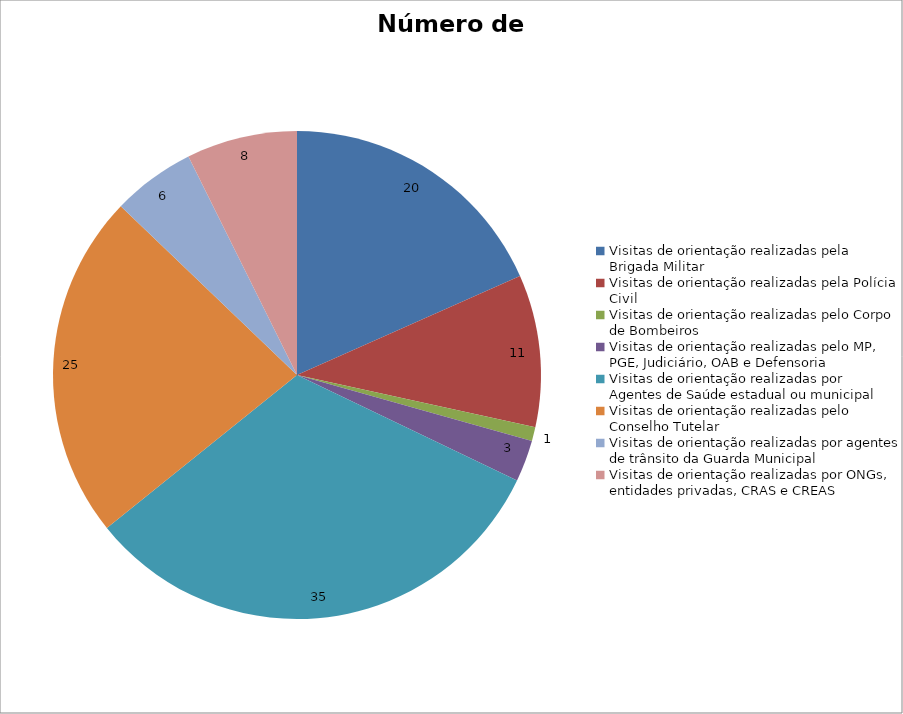
| Category | Número de Ações |
|---|---|
| Visitas de orientação realizadas pela Brigada Militar | 20 |
| Visitas de orientação realizadas pela Polícia Civil | 11 |
| Visitas de orientação realizadas pelo Corpo de Bombeiros | 1 |
| Visitas de orientação realizadas pelo MP, PGE, Judiciário, OAB e Defensoria | 3 |
| Visitas de orientação realizadas por Agentes de Saúde estadual ou municipal | 35 |
| Visitas de orientação realizadas pelo Conselho Tutelar | 25 |
| Visitas de orientação realizadas por agentes de trânsito da Guarda Municipal | 6 |
| Visitas de orientação realizadas por ONGs, entidades privadas, CRAS e CREAS | 8 |